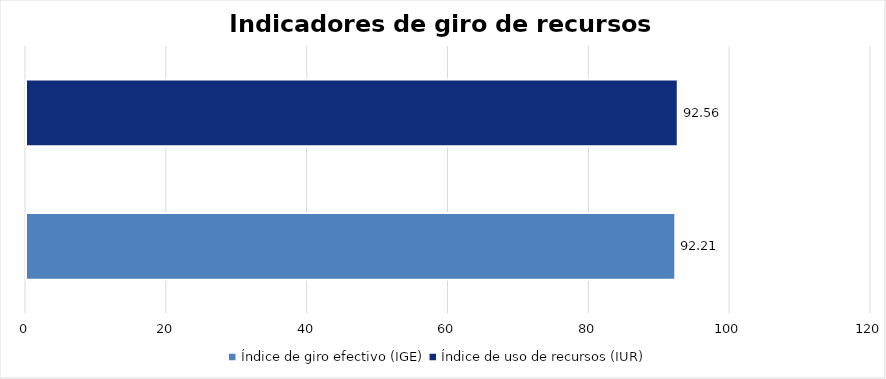
| Category | Series 0 |
|---|---|
| Índice de giro efectivo (IGE) | 92.208 |
| Índice de uso de recursos (IUR)  | 92.558 |